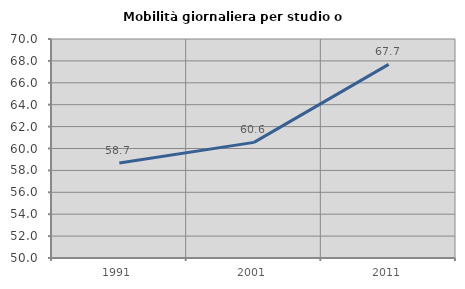
| Category | Mobilità giornaliera per studio o lavoro |
|---|---|
| 1991.0 | 58.668 |
| 2001.0 | 60.561 |
| 2011.0 | 67.68 |